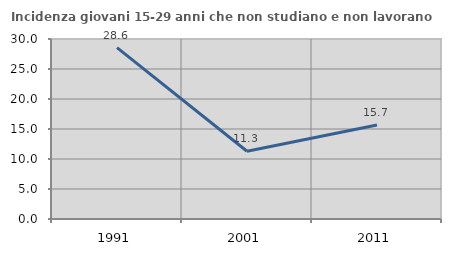
| Category | Incidenza giovani 15-29 anni che non studiano e non lavorano  |
|---|---|
| 1991.0 | 28.571 |
| 2001.0 | 11.287 |
| 2011.0 | 15.654 |